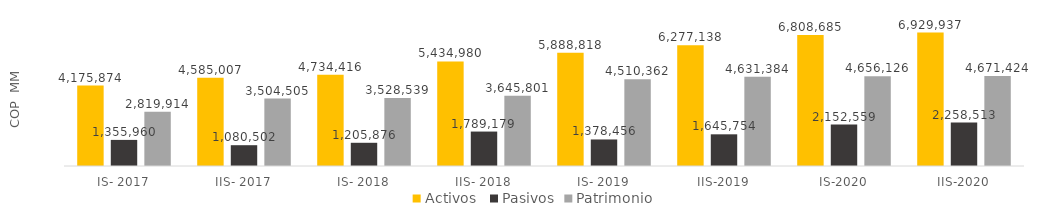
| Category | Activos  | Pasivos | Patrimonio |
|---|---|---|---|
|  IS- 2017  | 4175874.252 | 1355960.002 | 2819914.25 |
| IIS- 2017 | 4585006.669 | 1080501.898 | 3504504.771 |
| IS- 2018 | 4734415.715 | 1205876.264 | 3528539.451 |
| IIS- 2018 | 5434979.988 | 1789179.335 | 3645800.66 |
| IS- 2019 | 5888817.819 | 1378456.01 | 4510361.809 |
| IIS-2019 | 6277137.625 | 1645753.686 | 4631383.939 |
| IS-2020 | 6808684.575 | 2152558.617 | 4656125.958 |
| IIS-2020 | 6929937.332 | 2258512.855 | 4671424.477 |